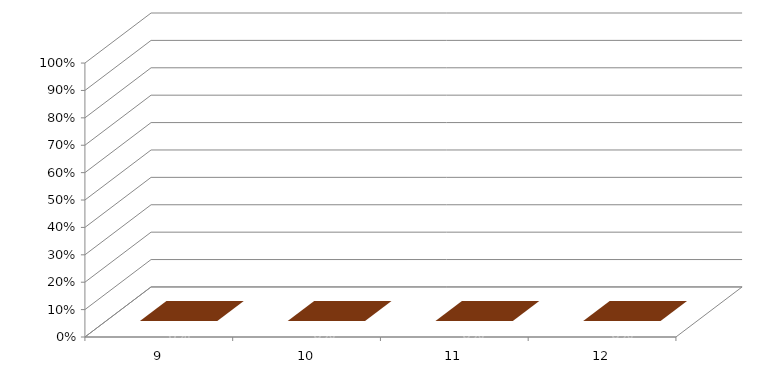
| Category | Series 3 |
|---|---|
| 9.0 | 0 |
| 10.0 | 0 |
| 11.0 | 0 |
| 12.0 | 0 |